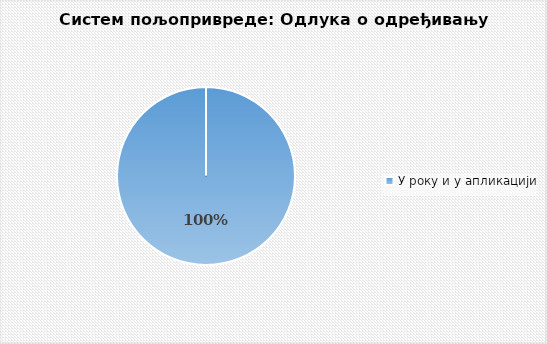
| Category | Series 0 |
|---|---|
| У року и у апликацији | 1 |